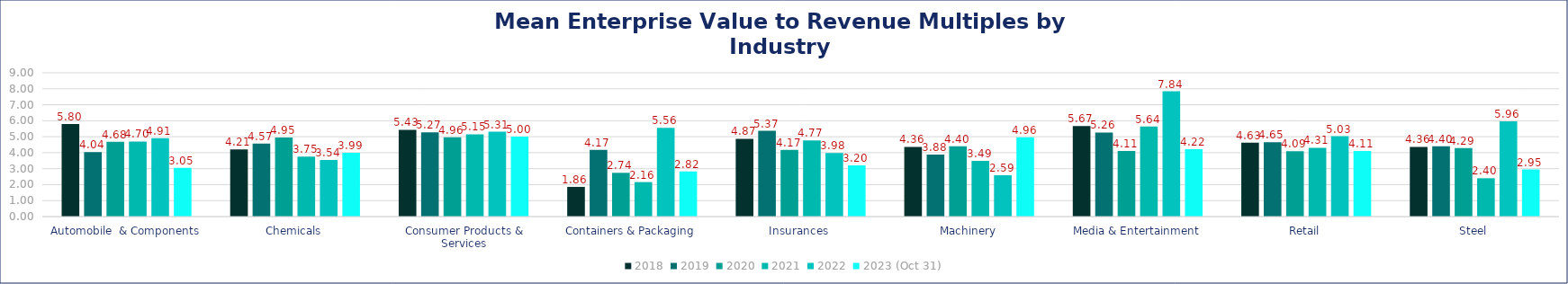
| Category | 2018 | 2019 | 2020 | 2021 | 2022 | 2023 (Oct 31) |
|---|---|---|---|---|---|---|
| Automobile  & Components | 5.8 | 4.04 | 4.68 | 4.7 | 4.91 | 3.05 |
| Chemicals | 4.21 | 4.57 | 4.95 | 3.75 | 3.54 | 3.99 |
| Consumer Products & Services | 5.43 | 5.27 | 4.96 | 5.15 | 5.31 | 5 |
| Containers & Packaging | 1.86 | 4.17 | 2.74 | 2.16 | 5.56 | 2.82 |
| Insurances | 4.87 | 5.37 | 4.17 | 4.77 | 3.98 | 3.2 |
| Machinery | 4.36 | 3.88 | 4.4 | 3.49 | 2.59 | 4.96 |
| Media & Entertainment | 5.67 | 5.26 | 4.11 | 5.64 | 7.84 | 4.22 |
| Retail | 4.63 | 4.65 | 4.09 | 4.31 | 5.03 | 4.11 |
| Steel | 4.36 | 4.4 | 4.29 | 2.4 | 5.96 | 2.95 |